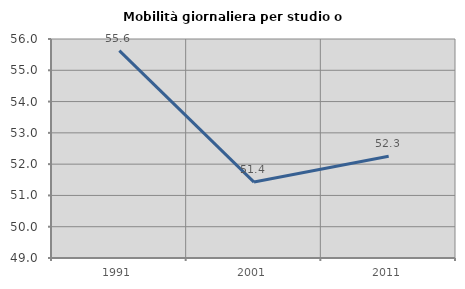
| Category | Mobilità giornaliera per studio o lavoro |
|---|---|
| 1991.0 | 55.63 |
| 2001.0 | 51.427 |
| 2011.0 | 52.251 |